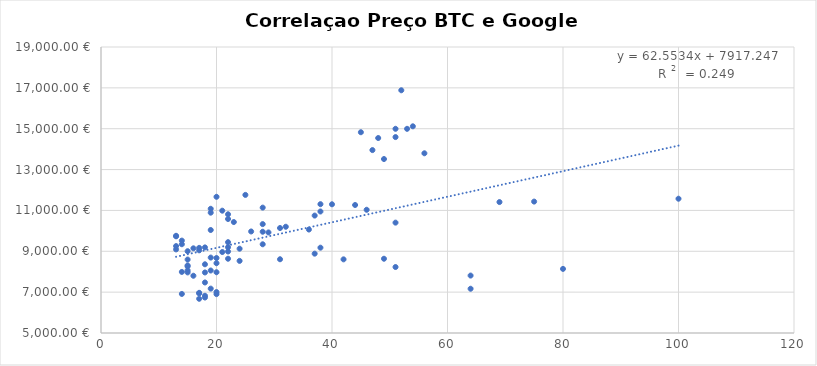
| Category | Fechamento_D1 |
|---|---|
| 45.0 | 14828 |
| 54.0 | 15117.7 |
| 53.0 | 14994.5 |
| 52.0 | 16882 |
| 51.0 | 14995.8 |
| 51.0 | 14590.6 |
| 48.0 | 14544 |
| 49.0 | 13515.8 |
| 56.0 | 13797.3 |
| 47.0 | 13954.1 |
| 37.0 | 10748.1 |
| 75.0 | 11432.9 |
| 100.0 | 11573.4 |
| 69.0 | 11409.6 |
| 51.0 | 10402 |
| 46.0 | 11031.9 |
| 44.0 | 11265.9 |
| 40.0 | 11300.8 |
| 38.0 | 10947.5 |
| 38.0 | 11305.9 |
| 32.0 | 10201 |
| 36.0 | 10064.6 |
| 38.0 | 9176.4 |
| 49.0 | 8635 |
| 64.0 | 7166.7 |
| 64.0 | 7811.5 |
| 80.0 | 8138.3 |
| 51.0 | 8229.7 |
| 42.0 | 8605.5 |
| 37.0 | 8884 |
| 31.0 | 8610 |
| 28.0 | 9343.1 |
| 29.0 | 9922.9 |
| 31.0 | 10138.4 |
| 28.0 | 11137.4 |
| 25.0 | 11760 |
| 28.0 | 10330.2 |
| 28.0 | 9956.7 |
| 26.0 | 9970.2 |
| 23.0 | 10431.1 |
| 22.0 | 10811.5 |
| 22.0 | 10581.5 |
| 21.0 | 10987.6 |
| 19.0 | 11080.3 |
| 20.0 | 11667.1 |
| 19.0 | 10890.1 |
| 19.0 | 10041.7 |
| 22.0 | 9445.8 |
| 22.0 | 9199 |
| 24.0 | 9127.1 |
| 17.0 | 9167.6 |
| 20.0 | 8416.3 |
| 18.0 | 8363.6 |
| 22.0 | 8635.6 |
| 24.0 | 8530.1 |
| 22.0 | 8989.2 |
| 21.0 | 8963.2 |
| 20.0 | 8671.2 |
| 19.0 | 8692.4 |
| 18.0 | 7963.8 |
| 15.0 | 8064.7 |
| 20.0 | 7974.5 |
| 19.0 | 7172 |
| 17.0 | 6938.5 |
| 20.0 | 7003.9 |
| 18.0 | 7473.7 |
| 20.0 | 6903.5 |
| 18.0 | 6823.1 |
| 17.0 | 6674.7 |
| 18.0 | 6736.9 |
| 14.0 | 6912.1 |
| 17.0 | 6966.4 |
| 16.0 | 7802.7 |
| 15.0 | 7965.9 |
| 19.0 | 8058.9 |
| 14.0 | 7989.6 |
| 15.0 | 8261.5 |
| 15.0 | 8305.7 |
| 15.0 | 8595.3 |
| 15.0 | 9003.9 |
| 14.0 | 9522.5 |
| 16.0 | 9145.1 |
| 18.0 | 9190.3 |
| 17.0 | 9047.1 |
| 14.0 | 9345.9 |
| 13.0 | 9091.7 |
| 13.0 | 9254.4 |
| 13.0 | 9733.4 |
| 13.0 | 9758.2 |